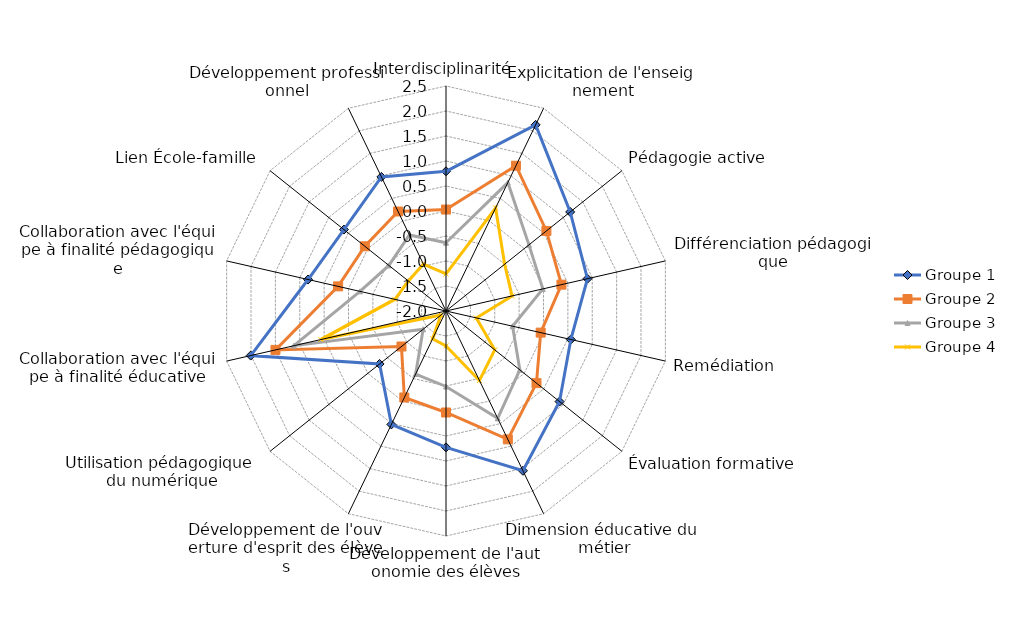
| Category | Groupe 1 | Groupe 2 | Groupe 3 | Groupe 4 |
|---|---|---|---|---|
| Interdisciplinarité | 0.794 | 0.029 | -0.634 | -1.259 |
| Explicitation de l'enseignement | 2.132 | 1.225 | 0.85 | 0.287 |
| Pédagogie active | 1.177 | 0.568 | 0.122 | -0.5 |
| Différenciation pédagogique | 0.902 | 0.368 | -0.014 | -0.645 |
| Remédiation | 0.561 | -0.057 | -0.635 | -1.379 |
| Évaluation formative | 0.905 | 0.314 | -0.112 | -0.753 |
| Dimension éducative du métier | 1.547 | 0.849 | 0.384 | -0.459 |
| Développement de l'autonomie des élèves | 0.727 | 0.03 | -0.49 | -1.303 |
| Développement de l'ouverture d'esprit des élèves | 0.518 | -0.08 | -0.601 | -1.383 |
| Utilisation pédagogique du numérique | -0.301 | -0.861 | -1.416 | -1.871 |
| Collaboration avec l'équipe à finalité éducative | 2.006 | 1.498 | 1.119 | 0.57 |
| Collaboration avec l'équipe à finalité pédagogique | 0.829 | 0.213 | -0.235 | -0.95 |
| Lien École-famille | 0.611 | 0.076 | -0.539 | -1.039 |
| Développement professionnel | 0.977 | 0.209 | -0.313 | -0.957 |